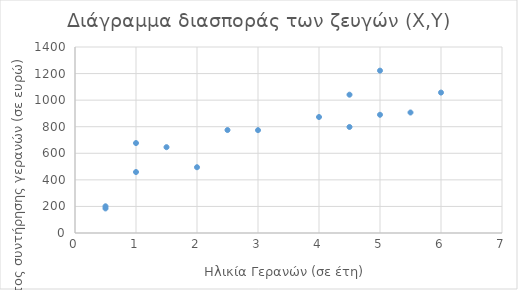
| Category | Series 0 |
|---|---|
| 4.5 | 1041 |
| 2.5 | 775 |
| 5.0 | 1222 |
| 5.5 | 907 |
| 0.5 | 185 |
| 6.0 | 1057 |
| 1.0 | 677 |
| 3.0 | 774 |
| 2.0 | 495 |
| 5.0 | 890 |
| 4.5 | 798 |
| 0.5 | 201 |
| 4.0 | 873 |
| 1.5 | 646 |
| 1.0 | 459 |